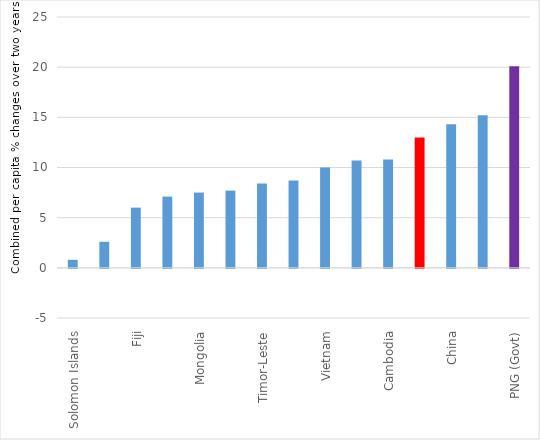
| Category | 2014 and 2015 combined GDP per capita income growth percentage changes |
|---|---|
| Solomon Islands | 0.8 |
| Thailand | 2.6 |
| Fiji | 6 |
| Indonesia | 7.1 |
| Mongolia | 7.5 |
| Malaysia | 7.7 |
| Timor-Leste | 8.4 |
| Philippines | 8.7 |
| Vietnam | 10 |
| Lao PDR | 10.7 |
| Cambodia | 10.8 |
| PNG (World Bank) | 13 |
| China | 14.3 |
| Myanmar | 15.2 |
| PNG (Govt) | 20.1 |